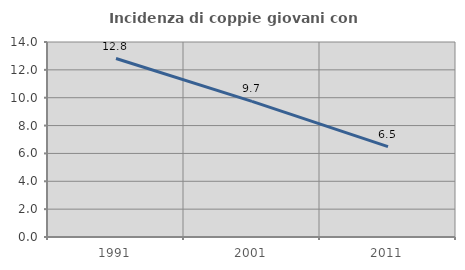
| Category | Incidenza di coppie giovani con figli |
|---|---|
| 1991.0 | 12.811 |
| 2001.0 | 9.74 |
| 2011.0 | 6.491 |